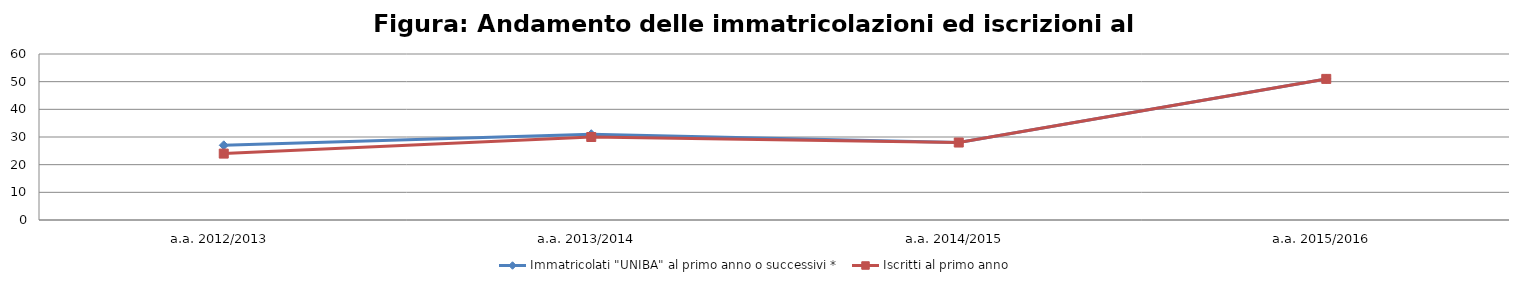
| Category | Immatricolati "UNIBA" al primo anno o successivi * | Iscritti al primo anno  |
|---|---|---|
| a.a. 2012/2013 | 27 | 24 |
| a.a. 2013/2014 | 31 | 30 |
| a.a. 2014/2015 | 28 | 28 |
| a.a. 2015/2016 | 51 | 51 |